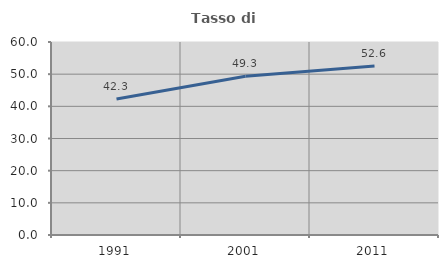
| Category | Tasso di occupazione   |
|---|---|
| 1991.0 | 42.273 |
| 2001.0 | 49.328 |
| 2011.0 | 52.571 |